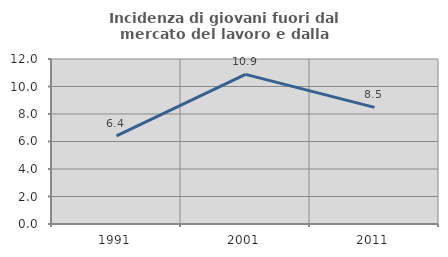
| Category | Incidenza di giovani fuori dal mercato del lavoro e dalla formazione  |
|---|---|
| 1991.0 | 6.406 |
| 2001.0 | 10.881 |
| 2011.0 | 8.485 |